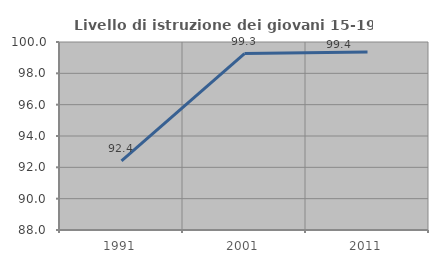
| Category | Livello di istruzione dei giovani 15-19 anni |
|---|---|
| 1991.0 | 92.413 |
| 2001.0 | 99.265 |
| 2011.0 | 99.367 |